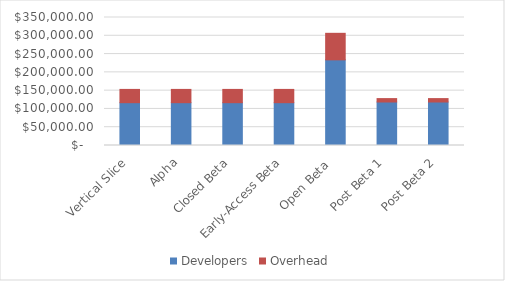
| Category | Developers | Overhead |
|---|---|---|
| Vertical Slice | 117082.577 | 36293.475 |
| Alpha | 117082.577 | 36293.475 |
| Closed Beta | 117082.577 | 36293.475 |
| Early-Access Beta | 117082.577 | 36293.475 |
| Open Beta  | 234165.154 | 72586.95 |
| Post Beta 1 | 118937.708 | 9324 |
| Post Beta 2 | 118937.708 | 9324 |